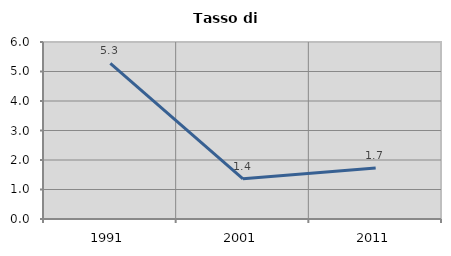
| Category | Tasso di disoccupazione   |
|---|---|
| 1991.0 | 5.272 |
| 2001.0 | 1.361 |
| 2011.0 | 1.727 |